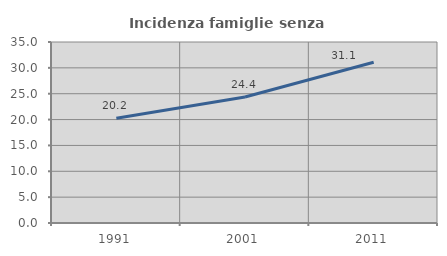
| Category | Incidenza famiglie senza nuclei |
|---|---|
| 1991.0 | 20.237 |
| 2001.0 | 24.369 |
| 2011.0 | 31.086 |